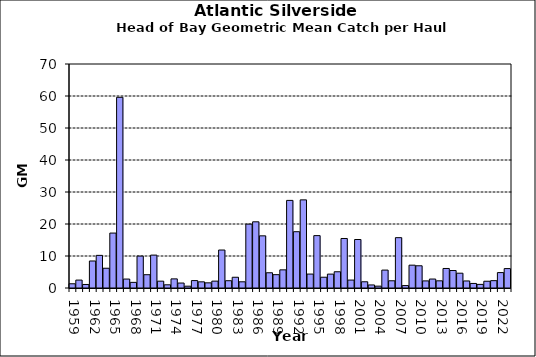
| Category | Series 0 |
|---|---|
| 1959.0 | 1.323 |
| 1960.0 | 2.472 |
| 1961.0 | 1.099 |
| 1962.0 | 8.442 |
| 1963.0 | 10.197 |
| 1964.0 | 6.172 |
| 1965.0 | 17.168 |
| 1966.0 | 59.593 |
| 1967.0 | 2.797 |
| 1968.0 | 1.76 |
| 1969.0 | 9.969 |
| 1970.0 | 4.153 |
| 1971.0 | 10.28 |
| 1972.0 | 2.138 |
| 1973.0 | 0.997 |
| 1974.0 | 2.851 |
| 1975.0 | 1.55 |
| 1976.0 | 0.567 |
| 1977.0 | 2.316 |
| 1978.0 | 1.927 |
| 1979.0 | 1.613 |
| 1980.0 | 2.147 |
| 1981.0 | 11.869 |
| 1982.0 | 2.277 |
| 1983.0 | 3.356 |
| 1984.0 | 1.937 |
| 1985.0 | 19.957 |
| 1986.0 | 20.686 |
| 1987.0 | 16.302 |
| 1988.0 | 4.766 |
| 1989.0 | 4.167 |
| 1990.0 | 5.669 |
| 1991.0 | 27.375 |
| 1992.0 | 17.588 |
| 1993.0 | 27.54 |
| 1994.0 | 4.353 |
| 1995.0 | 16.37 |
| 1996.0 | 3.369 |
| 1997.0 | 4.34 |
| 1998.0 | 5.074 |
| 1999.0 | 15.473 |
| 2000.0 | 2.478 |
| 2001.0 | 15.152 |
| 2002.0 | 1.946 |
| 2003.0 | 0.954 |
| 2004.0 | 0.58 |
| 2005.0 | 5.597 |
| 2006.0 | 2.257 |
| 2007.0 | 15.729 |
| 2008.0 | 0.76 |
| 2009.0 | 7.136 |
| 2010.0 | 6.947 |
| 2011.0 | 2.22 |
| 2012.0 | 2.802 |
| 2013.0 | 2.245 |
| 2014.0 | 6.1 |
| 2015.0 | 5.461 |
| 2016.0 | 4.627 |
| 2017.0 | 2.198 |
| 2018.0 | 1.425 |
| 2019.0 | 1.129 |
| 2020.0 | 2.11 |
| 2021.0 | 2.299 |
| 2022.0 | 4.818 |
| 2023.0 | 6.067 |